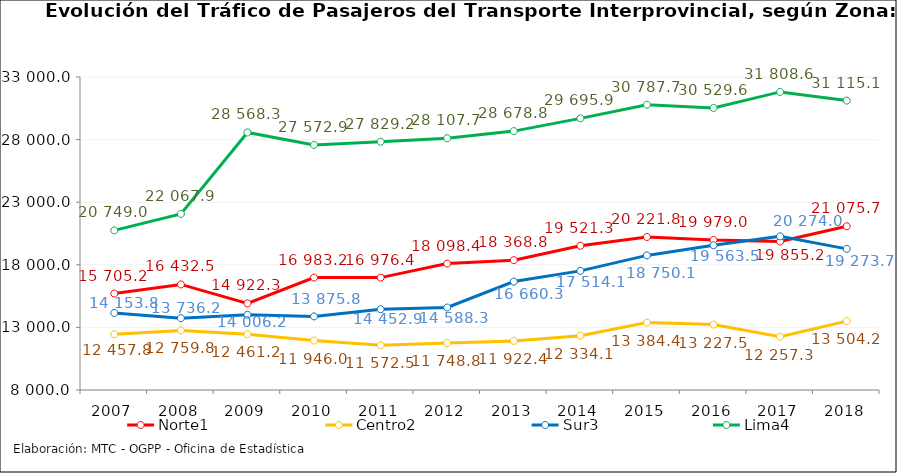
| Category | Norte1 | Centro2 | Sur3 | Lima4 |
|---|---|---|---|---|
| 2007.0 | 15705.24 | 12457.842 | 14153.829 | 20749.02 |
| 2008.0 | 16432.503 | 12759.816 | 13736.199 | 22067.91 |
| 2009.0 | 14922.3 | 12461.2 | 14006.2 | 28568.3 |
| 2010.0 | 16983.2 | 11946 | 13875.8 | 27572.9 |
| 2011.0 | 16976.4 | 11572.5 | 14452.9 | 27829.2 |
| 2012.0 | 18098.4 | 11748.8 | 14588.3 | 28107.7 |
| 2013.0 | 18368.8 | 11922.4 | 16660.3 | 28678.8 |
| 2014.0 | 19521.273 | 12334.061 | 17514.089 | 29695.892 |
| 2015.0 | 20221.8 | 13384.4 | 18750.1 | 30787.7 |
| 2016.0 | 19979 | 13227.5 | 19563.5 | 30529.6 |
| 2017.0 | 19855.2 | 12257.3 | 20274 | 31808.6 |
| 2018.0 | 21075.692 | 13504.24 | 19273.737 | 31115.06 |